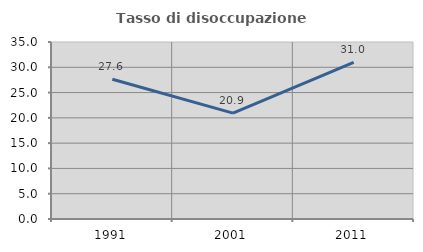
| Category | Tasso di disoccupazione giovanile  |
|---|---|
| 1991.0 | 27.642 |
| 2001.0 | 20.942 |
| 2011.0 | 30.952 |